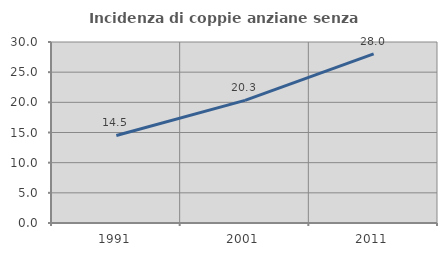
| Category | Incidenza di coppie anziane senza figli  |
|---|---|
| 1991.0 | 14.504 |
| 2001.0 | 20.325 |
| 2011.0 | 28.042 |